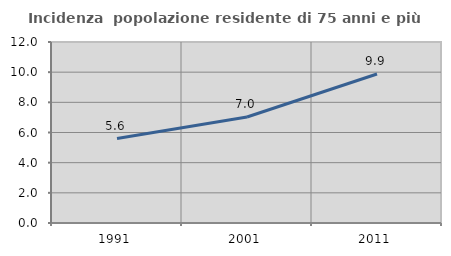
| Category | Incidenza  popolazione residente di 75 anni e più |
|---|---|
| 1991.0 | 5.598 |
| 2001.0 | 7.031 |
| 2011.0 | 9.881 |